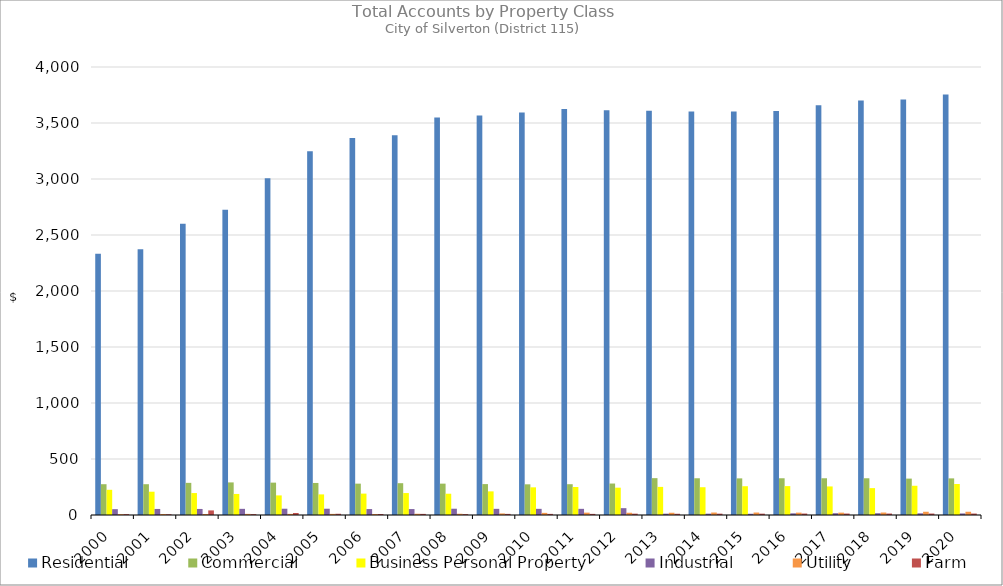
| Category | Residential | Commercial | Business Personal Property | Industrial | Utility | Farm |
|---|---|---|---|---|---|---|
| 2000.0 | 2333 | 275 | 225 | 52 | 8 | 8 |
| 2001.0 | 2373 | 275 | 208 | 54 | 9 | 7 |
| 2002.0 | 2601 | 287 | 196 | 54 | 9 | 41 |
| 2003.0 | 2726 | 291 | 188 | 55 | 10 | 8 |
| 2004.0 | 3007 | 289 | 175 | 56 | 10 | 18 |
| 2005.0 | 3248 | 286 | 184 | 56 | 10 | 11 |
| 2006.0 | 3365 | 280 | 191 | 53 | 9 | 9 |
| 2007.0 | 3390 | 284 | 196 | 53 | 11 | 10 |
| 2008.0 | 3549 | 280 | 190 | 56 | 11 | 8 |
| 2009.0 | 3568 | 276 | 211 | 55 | 14 | 10 |
| 2010.0 | 3594 | 274 | 247 | 55 | 19 | 10 |
| 2011.0 | 3625 | 275 | 250 | 55 | 21 | 10 |
| 2012.0 | 3614 | 281 | 244 | 61 | 20 | 12 |
| 2013.0 | 3609 | 329 | 251 | 12 | 20 | 11 |
| 2014.0 | 3602 | 328 | 248 | 12 | 22 | 12 |
| 2015.0 | 3603 | 327 | 257 | 11 | 22 | 12 |
| 2016.0 | 3608 | 328 | 258 | 15 | 21 | 13 |
| 2017.0 | 3659 | 328 | 255 | 16 | 21 | 13 |
| 2018.0 | 3701 | 328 | 240 | 16 | 22 | 13 |
| 2019.0 | 3710 | 325 | 261 | 15 | 29 | 13 |
| 2020.0 | 3755 | 327 | 277 | 14 | 29 | 13 |